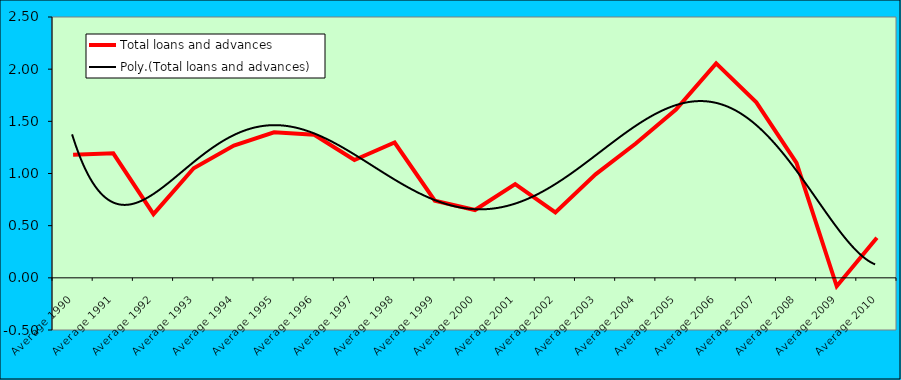
| Category | Total loans and advances |
|---|---|
| Average 1990 | 1.179 |
| Average 1991 | 1.193 |
| Average 1992 | 0.61 |
| Average 1993 | 1.051 |
| Average 1994 | 1.268 |
| Average 1995 | 1.394 |
| Average 1996 | 1.371 |
| Average 1997 | 1.129 |
| Average 1998 | 1.297 |
| Average 1999 | 0.739 |
| Average 2000 | 0.65 |
| Average 2001 | 0.898 |
| Average 2002 | 0.627 |
| Average 2003 | 0.992 |
| Average 2004 | 1.287 |
| Average 2005 | 1.613 |
| Average 2006 | 2.055 |
| Average 2007 | 1.682 |
| Average 2008 | 1.102 |
| Average 2009 | -0.081 |
| Average 2010 | 0.385 |